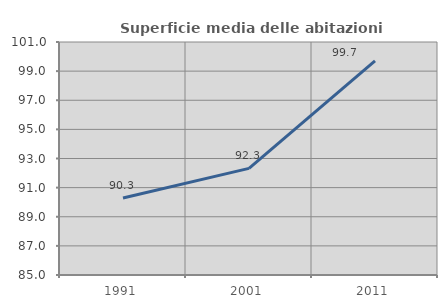
| Category | Superficie media delle abitazioni occupate |
|---|---|
| 1991.0 | 90.292 |
| 2001.0 | 92.322 |
| 2011.0 | 99.708 |